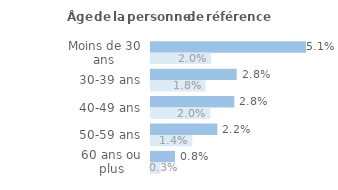
| Category | Series 1 | Series 0 |
|---|---|---|
| Moins de 30 ans | 0.051 | 0.02 |
| 30-39 ans | 0.028 | 0.018 |
| 40-49 ans | 0.028 | 0.02 |
| 50-59 ans | 0.022 | 0.014 |
| 60 ans ou plus | 0.008 | 0.003 |